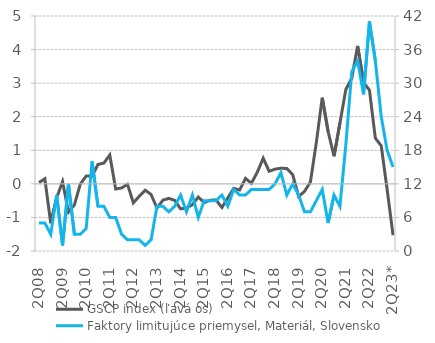
| Category | GSCP index (ľavá os) |
|---|---|
| 2Q08 | 0.04 |
| 3Q08 | 0.149 |
| 4Q08 | -1.171 |
| 1Q09 | -0.415 |
| 2Q09 | 0.066 |
| 3Q09 | -0.84 |
| 4Q09 | -0.631 |
| 1Q10 | -0.008 |
| 2Q10 | 0.232 |
| 3Q10 | 0.231 |
| 4Q10 | 0.579 |
| 1Q11 | 0.619 |
| 2Q11 | 0.861 |
| 3Q11 | -0.153 |
| 4Q11 | -0.124 |
| 1Q12 | -0.012 |
| 2Q12 | -0.565 |
| 3Q12 | -0.369 |
| 4Q12 | -0.189 |
| 1Q13 | -0.316 |
| 2Q13 | -0.722 |
| 3Q13 | -0.484 |
| 4Q13 | -0.434 |
| 1Q14 | -0.492 |
| 2Q14 | -0.744 |
| 3Q14 | -0.72 |
| 4Q14 | -0.619 |
| 1Q15 | -0.392 |
| 2Q15 | -0.558 |
| 3Q15 | -0.488 |
| 4Q15 | -0.479 |
| 1Q16 | -0.705 |
| 2Q16 | -0.421 |
| 3Q16 | -0.133 |
| 4Q16 | -0.183 |
| 1Q17 | 0.163 |
| 2Q17 | 0.018 |
| 3Q17 | 0.349 |
| 4Q17 | 0.763 |
| 1Q18 | 0.376 |
| 2Q18 | 0.438 |
| 3Q18 | 0.465 |
| 4Q18 | 0.458 |
| 1Q19 | 0.271 |
| 2Q19 | -0.377 |
| 3Q19 | -0.224 |
| 4Q19 | 0.059 |
| 1Q20 | 1.23 |
| 2Q20 | 2.565 |
| 3Q20 | 1.556 |
| 4Q20 | 0.825 |
| 1Q21 | 1.81 |
| 2Q21 | 2.807 |
| 3Q21 | 3.148 |
| 4Q21 | 4.11 |
| 1Q22 | 3.024 |
| 2Q22 | 2.79 |
| 3Q22 | 1.362 |
| 4Q22 | 1.131 |
| 1Q23 | -0.168 |
| 2Q23* | -1.531 |